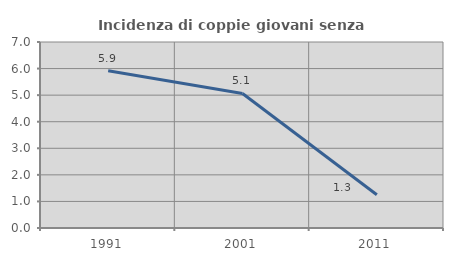
| Category | Incidenza di coppie giovani senza figli |
|---|---|
| 1991.0 | 5.921 |
| 2001.0 | 5.063 |
| 2011.0 | 1.25 |